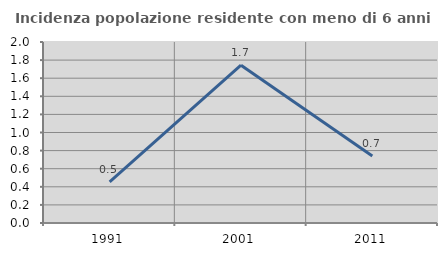
| Category | Incidenza popolazione residente con meno di 6 anni |
|---|---|
| 1991.0 | 0.455 |
| 2001.0 | 1.744 |
| 2011.0 | 0.741 |